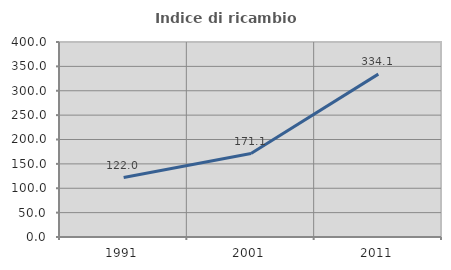
| Category | Indice di ricambio occupazionale  |
|---|---|
| 1991.0 | 122.004 |
| 2001.0 | 171.082 |
| 2011.0 | 334.146 |